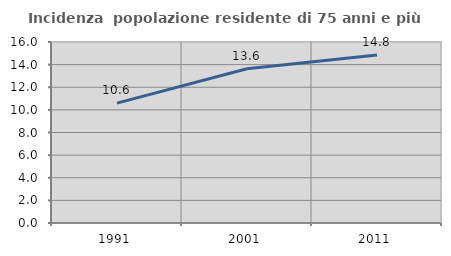
| Category | Incidenza  popolazione residente di 75 anni e più |
|---|---|
| 1991.0 | 10.595 |
| 2001.0 | 13.635 |
| 2011.0 | 14.849 |